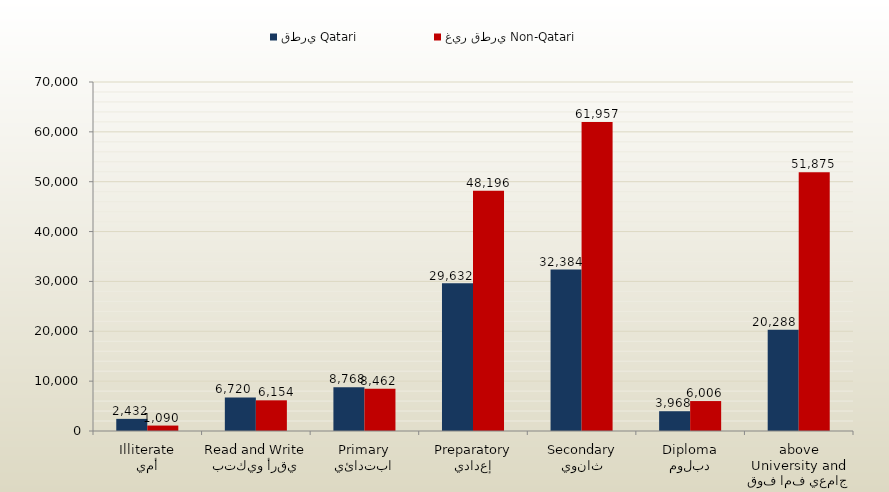
| Category | قطري Qatari | غير قطري Non-Qatari |
|---|---|---|
| أمي
Illiterate | 2432 | 1090 |
| يقرأ ويكتب
Read and Write | 6720 | 6154 |
| ابتدائي
Primary | 8768 | 8462 |
| إعدادي
Preparatory | 29632 | 48196 |
| ثانوي
Secondary | 32384 | 61957 |
| دبلوم
Diploma | 3968 | 6006 |
| جامعي فما فوق
University and above | 20288 | 51875 |